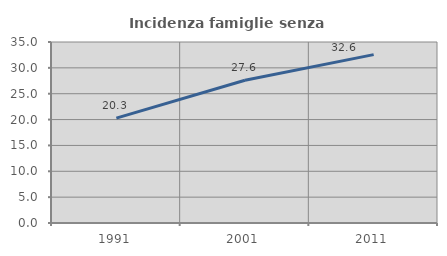
| Category | Incidenza famiglie senza nuclei |
|---|---|
| 1991.0 | 20.29 |
| 2001.0 | 27.597 |
| 2011.0 | 32.556 |